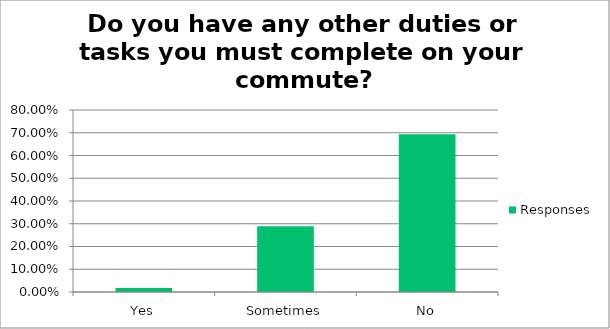
| Category | Responses |
|---|---|
| Yes | 0.017 |
| Sometimes | 0.289 |
| No | 0.693 |